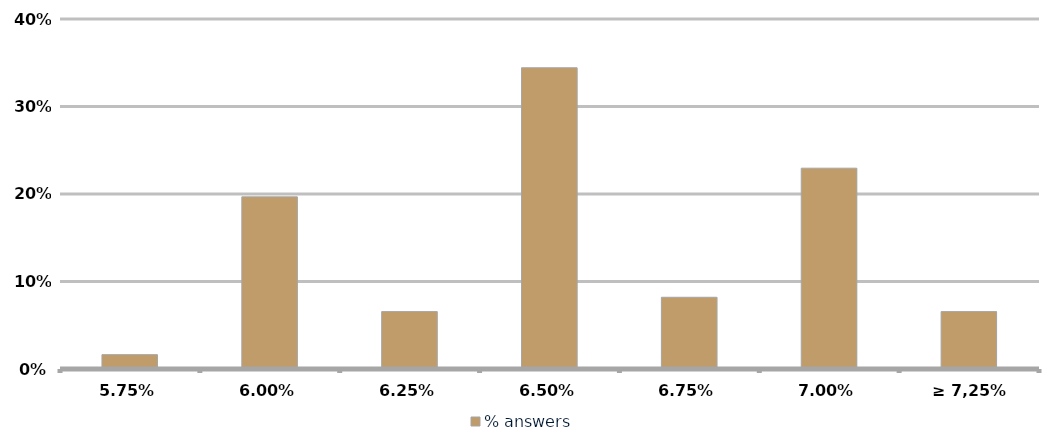
| Category | % answers |
|---|---|
| 5,75% | 0.016 |
| 6,00% | 0.197 |
| 6,25% | 0.066 |
| 6,50% | 0.344 |
| 6,75% | 0.082 |
| 7,00% | 0.23 |
| ≥ 7,25% | 0.066 |